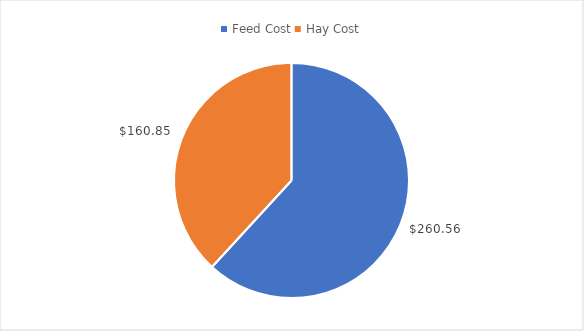
| Category | Series 0 |
|---|---|
| Feed Cost | 260.559 |
| Hay Cost | 160.852 |